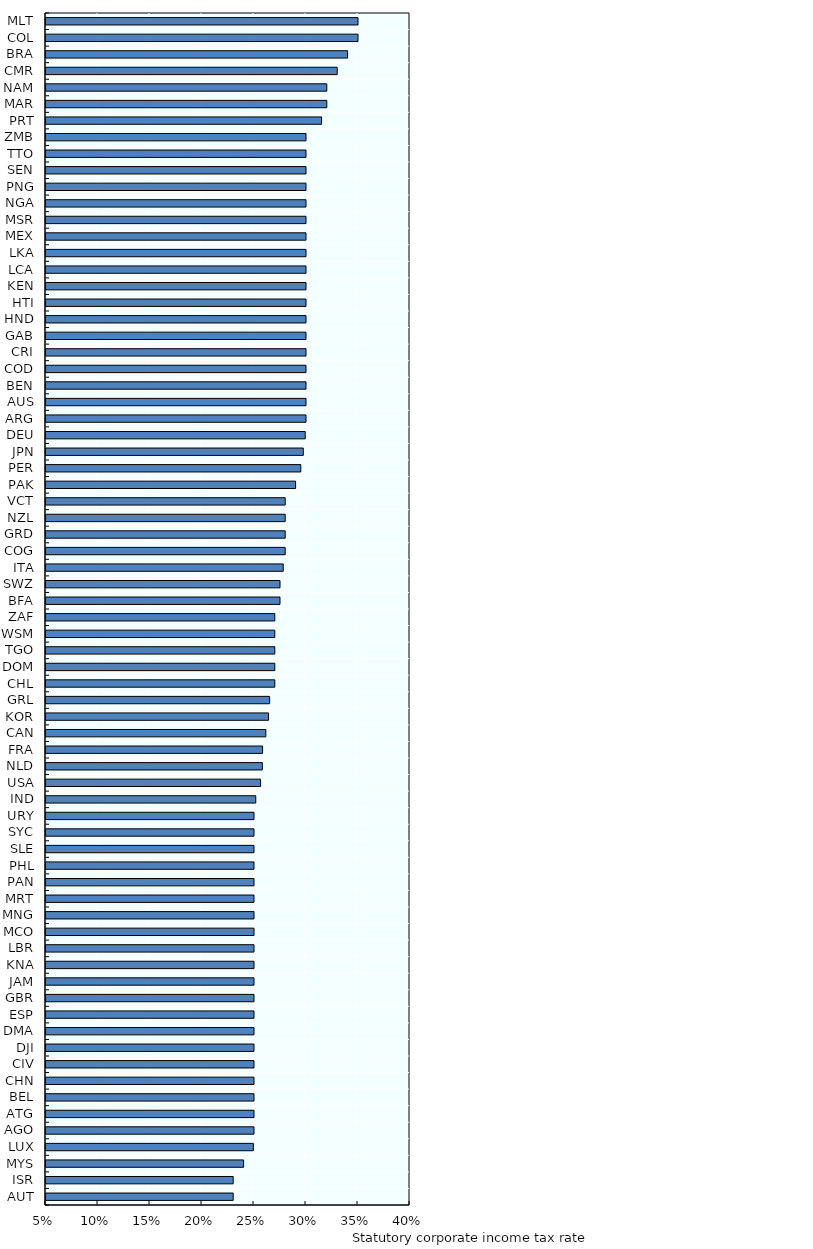
| Category | Series 0 |
|---|---|
| AUT | 0.23 |
| ISR | 0.23 |
| MYS | 0.24 |
| LUX | 0.249 |
| AGO | 0.25 |
| ATG | 0.25 |
| BEL | 0.25 |
| CHN | 0.25 |
| CIV | 0.25 |
| DJI | 0.25 |
| DMA | 0.25 |
| ESP | 0.25 |
| GBR | 0.25 |
| JAM | 0.25 |
| KNA | 0.25 |
| LBR | 0.25 |
| MCO | 0.25 |
| MNG | 0.25 |
| MRT | 0.25 |
| PAN | 0.25 |
| PHL | 0.25 |
| SLE | 0.25 |
| SYC | 0.25 |
| URY | 0.25 |
| IND | 0.252 |
| USA | 0.256 |
| NLD | 0.258 |
| FRA | 0.258 |
| CAN | 0.261 |
| KOR | 0.264 |
| GRL | 0.265 |
| CHL | 0.27 |
| DOM | 0.27 |
| TGO | 0.27 |
| WSM | 0.27 |
| ZAF | 0.27 |
| BFA | 0.275 |
| SWZ | 0.275 |
| ITA | 0.278 |
| COG | 0.28 |
| GRD | 0.28 |
| NZL | 0.28 |
| VCT | 0.28 |
| PAK | 0.29 |
| PER | 0.295 |
| JPN | 0.297 |
| DEU | 0.299 |
| ARG | 0.3 |
| AUS | 0.3 |
| BEN | 0.3 |
| COD | 0.3 |
| CRI | 0.3 |
| GAB | 0.3 |
| HND | 0.3 |
| HTI | 0.3 |
| KEN | 0.3 |
| LCA | 0.3 |
| LKA | 0.3 |
| MEX | 0.3 |
| MSR | 0.3 |
| NGA | 0.3 |
| PNG | 0.3 |
| SEN | 0.3 |
| TTO | 0.3 |
| ZMB | 0.3 |
| PRT | 0.315 |
| MAR | 0.32 |
| NAM | 0.32 |
| CMR | 0.33 |
| BRA | 0.34 |
| COL | 0.35 |
| MLT | 0.35 |